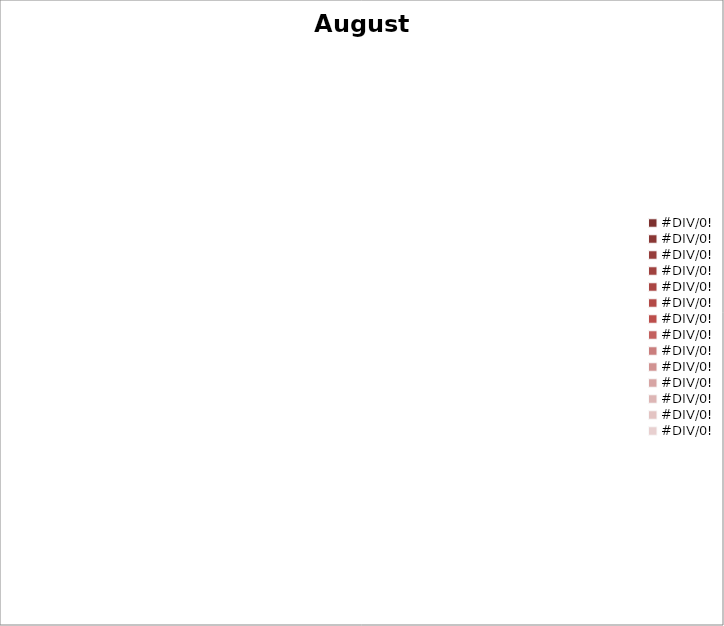
| Category | Series 0 |
|---|---|
| 0.0 | 0 |
| 0.0 | 0 |
| 0.0 | 0 |
| 0.0 | 0 |
| 0.0 | 0 |
| 0.0 | 0 |
| 0.0 | 0 |
| 0.0 | 0 |
| 0.0 | 0 |
| 0.0 | 0 |
| 0.0 | 0 |
| 0.0 | 0 |
| 0.0 | 0 |
| 0.0 | 0 |